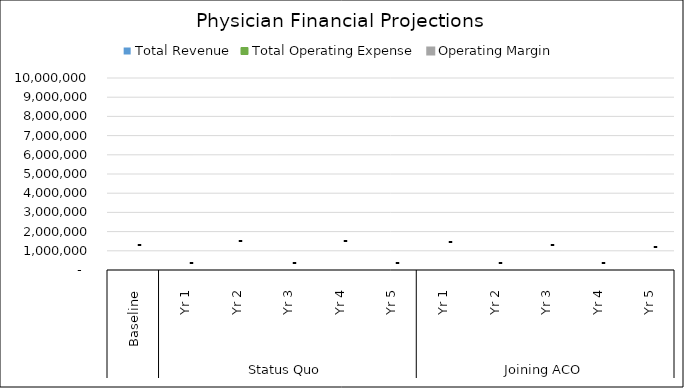
| Category |  Total Revenue  |  Total Operating Expense  |  Operating Margin  |
|---|---|---|---|
| 0 | 0 | 0 | 0 |
| 1 | 0 | 0 | 0 |
| 2 | 0 | 0 | 0 |
| 3 | 0 | 0 | 0 |
| 4 | 0 | 0 | 0 |
| 5 | 0 | 0 | 0 |
| 6 | 0 | 0 | 0 |
| 7 | 0 | 0 | 0 |
| 8 | 0 | 0 | 0 |
| 9 | 0 | 0 | 0 |
| 10 | 0 | 0 | 0 |